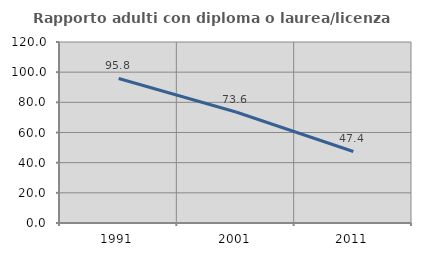
| Category | Rapporto adulti con diploma o laurea/licenza media  |
|---|---|
| 1991.0 | 95.833 |
| 2001.0 | 73.611 |
| 2011.0 | 47.423 |